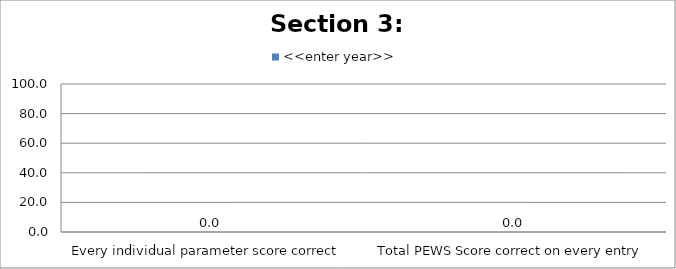
| Category | <<enter year>> |
|---|---|
| Every individual parameter score correct  | 0 |
| Total PEWS Score correct on every entry | 0 |